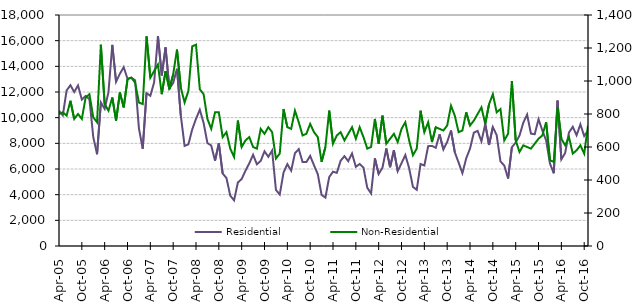
| Category | Residential |
|---|---|
| 2005-04-01 | 10540 |
| 2005-05-01 | 10180 |
| 2005-06-01 | 12120 |
| 2005-07-01 | 12530 |
| 2005-08-01 | 12000 |
| 2005-09-01 | 12510 |
| 2005-10-01 | 11410 |
| 2005-11-01 | 11690 |
| 2005-12-01 | 11430 |
| 2006-01-01 | 8500 |
| 2006-02-01 | 7150 |
| 2006-03-01 | 11180 |
| 2006-04-01 | 10690 |
| 2006-05-01 | 11990 |
| 2006-06-01 | 15670 |
| 2006-07-01 | 12790 |
| 2006-08-01 | 13430 |
| 2006-09-01 | 13930 |
| 2006-10-01 | 13030 |
| 2006-11-01 | 13120 |
| 2006-12-01 | 12920 |
| 2007-01-01 | 9170 |
| 2007-02-01 | 7580 |
| 2007-03-01 | 11920 |
| 2007-04-01 | 11700 |
| 2007-05-01 | 12750 |
| 2007-06-01 | 16360 |
| 2007-07-01 | 13290 |
| 2007-08-01 | 15480 |
| 2007-09-01 | 12270 |
| 2007-10-01 | 12700 |
| 2007-11-01 | 13810 |
| 2007-12-01 | 10180 |
| 2008-01-01 | 7800 |
| 2008-02-01 | 7920 |
| 2008-03-01 | 9080 |
| 2008-04-01 | 9910 |
| 2008-05-01 | 10620 |
| 2008-06-01 | 9580 |
| 2008-07-01 | 8020 |
| 2008-08-01 | 7830 |
| 2008-09-01 | 6650 |
| 2008-10-01 | 8000 |
| 2008-11-01 | 5650 |
| 2008-12-01 | 5300 |
| 2009-01-01 | 3920 |
| 2009-02-01 | 3560 |
| 2009-03-01 | 4950 |
| 2009-04-01 | 5220 |
| 2009-05-01 | 5870 |
| 2009-06-01 | 6440 |
| 2009-07-01 | 7110 |
| 2009-08-01 | 6370 |
| 2009-09-01 | 6630 |
| 2009-10-01 | 7380 |
| 2009-11-01 | 6950 |
| 2009-12-01 | 7440 |
| 2010-01-01 | 4370 |
| 2010-02-01 | 4010 |
| 2010-03-01 | 5720 |
| 2010-04-01 | 6380 |
| 2010-05-01 | 5870 |
| 2010-06-01 | 7230 |
| 2010-07-01 | 7550 |
| 2010-08-01 | 6540 |
| 2010-09-01 | 6540 |
| 2010-10-01 | 7020 |
| 2010-11-01 | 6290 |
| 2010-12-01 | 5600 |
| 2011-01-01 | 3980 |
| 2011-02-01 | 3770 |
| 2011-03-01 | 5370 |
| 2011-04-01 | 5790 |
| 2011-05-01 | 5700 |
| 2011-06-01 | 6640 |
| 2011-07-01 | 7000 |
| 2011-08-01 | 6610 |
| 2011-09-01 | 7210 |
| 2011-10-01 | 6170 |
| 2011-11-01 | 6390 |
| 2011-12-01 | 6110 |
| 2012-01-01 | 4540 |
| 2012-02-01 | 4100 |
| 2012-03-01 | 6830 |
| 2012-04-01 | 5610 |
| 2012-05-01 | 6110 |
| 2012-06-01 | 7600 |
| 2012-07-01 | 6140 |
| 2012-08-01 | 7460 |
| 2012-09-01 | 5830 |
| 2012-10-01 | 6450 |
| 2012-11-01 | 7090 |
| 2012-12-01 | 6070 |
| 2013-01-01 | 4610 |
| 2013-02-01 | 4380 |
| 2013-03-01 | 6390 |
| 2013-04-01 | 6270 |
| 2013-05-01 | 7780 |
| 2013-06-01 | 7800 |
| 2013-07-01 | 7650 |
| 2013-08-01 | 8700 |
| 2013-09-01 | 7520 |
| 2013-10-01 | 8110 |
| 2013-11-01 | 9000 |
| 2013-12-01 | 7310 |
| 2014-01-01 | 6500 |
| 2014-02-01 | 5680 |
| 2014-03-01 | 6830 |
| 2014-04-01 | 7590 |
| 2014-05-01 | 8830 |
| 2014-06-01 | 8970 |
| 2014-07-01 | 8160 |
| 2014-08-01 | 9500 |
| 2014-09-01 | 7870 |
| 2014-10-01 | 9270 |
| 2014-11-01 | 8640 |
| 2014-12-01 | 6590 |
| 2015-01-01 | 6270 |
| 2015-02-01 | 5260 |
| 2015-03-01 | 7700 |
| 2015-04-01 | 8060 |
| 2015-05-01 | 8600 |
| 2015-06-01 | 9610 |
| 2015-07-01 | 10240 |
| 2015-08-01 | 8760 |
| 2015-09-01 | 8710 |
| 2015-10-01 | 9880 |
| 2015-11-01 | 9000 |
| 2015-12-01 | 8230 |
| 2016-01-01 | 6430 |
| 2016-02-01 | 5670 |
| 2016-03-01 | 11330 |
| 2016-04-01 | 6750 |
| 2016-05-01 | 7250 |
| 2016-06-01 | 8850 |
| 2016-07-01 | 9290 |
| 2016-08-01 | 8630 |
| 2016-09-01 | 9480 |
| 2016-10-01 | 8570 |
| 2016-11-01 | 8990 |